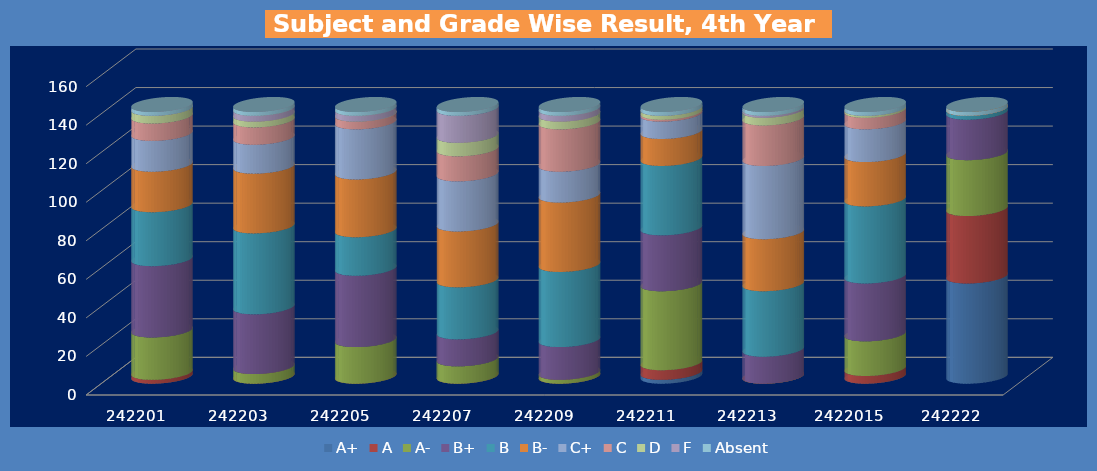
| Category | A+ | A | A- | B+ | B | B- | C+ | C | D | F | Absent |
|---|---|---|---|---|---|---|---|---|---|---|---|
| 242201.0 | 0 | 2 | 22 | 37 | 28 | 21 | 16 | 9 | 4 | 0 | 2 |
| 242203.0 | 0 | 0 | 5 | 31 | 42 | 31 | 15 | 9 | 3 | 3 | 2 |
| 242205.0 | 0 | 0 | 19 | 37 | 20 | 30 | 26 | 4 | 0 | 3 | 2 |
| 242207.0 | 0 | 0 | 9 | 14 | 27 | 29 | 26 | 13 | 7 | 14 | 2 |
| 242209.0 | 0 | 0 | 2 | 17 | 39 | 36 | 16 | 22 | 4 | 3 | 2 |
| 242211.0 | 2 | 5 | 41 | 29 | 36 | 14 | 9 | 1 | 2 | 0 | 2 |
| 242213.0 | 0 | 0 | 0 | 14 | 34 | 27 | 38 | 21 | 4 | 1 | 2 |
| 2422015.0 | 0 | 4 | 18 | 30 | 40 | 23 | 17 | 6 | 1 | 0 | 2 |
| 242222.0 | 52 | 35 | 29 | 21 | 2 | 0 | 0 | 0 | 0 | 0 | 2 |